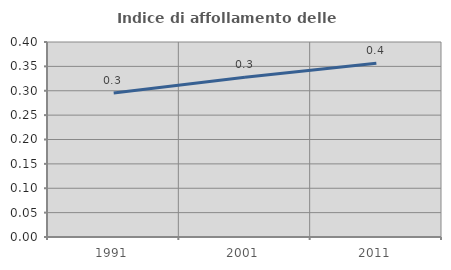
| Category | Indice di affollamento delle abitazioni  |
|---|---|
| 1991.0 | 0.296 |
| 2001.0 | 0.328 |
| 2011.0 | 0.356 |